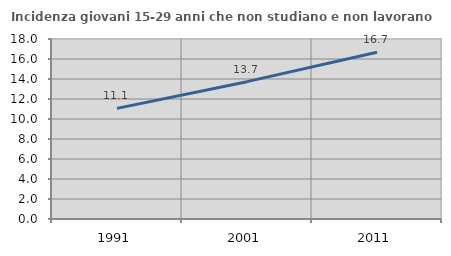
| Category | Incidenza giovani 15-29 anni che non studiano e non lavorano  |
|---|---|
| 1991.0 | 11.063 |
| 2001.0 | 13.734 |
| 2011.0 | 16.667 |